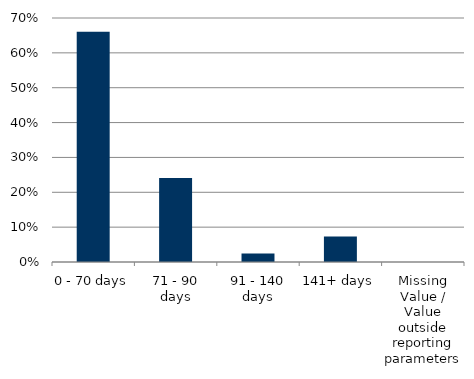
| Category | Total |
|---|---|
| 0 - 70 days | 0.661 |
| 71 - 90 days | 0.241 |
| 91 - 140 days | 0.024 |
| 141+ days | 0.073 |
| Missing Value / Value outside reporting parameters | 0 |